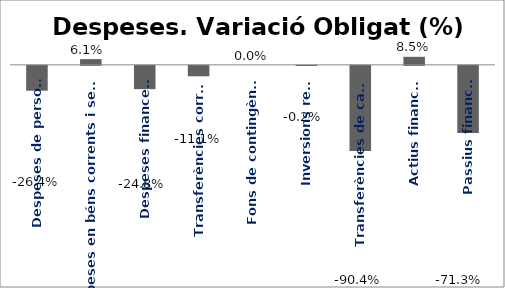
| Category | Series 0 |
|---|---|
| Despeses de personal | -0.264 |
| Despeses en béns corrents i serveis | 0.061 |
| Despeses financeres | -0.248 |
| Transferències corrents | -0.111 |
| Fons de contingència | 0 |
| Inversions reals | -0.002 |
| Transferències de capital | -0.904 |
| Actius financers | 0.085 |
| Passius financers | -0.713 |